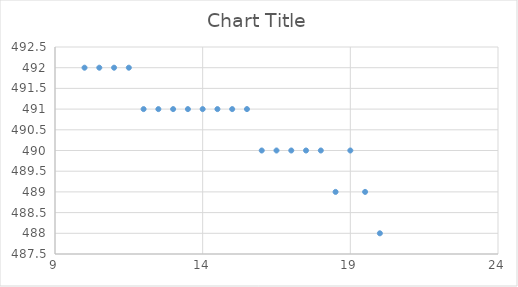
| Category | Series 0 |
|---|---|
| 20.0 | 488 |
| 19.5 | 489 |
| 19.0 | 490 |
| 18.5 | 489 |
| 18.0 | 490 |
| 17.5 | 490 |
| 17.0 | 490 |
| 16.5 | 490 |
| 16.0 | 490 |
| 15.5 | 491 |
| 15.0 | 491 |
| 14.5 | 491 |
| 14.0 | 491 |
| 13.5 | 491 |
| 13.0 | 491 |
| 12.5 | 491 |
| 12.0 | 491 |
| 11.5 | 492 |
| 11.0 | 492 |
| 10.5 | 492 |
| 10.0 | 492 |